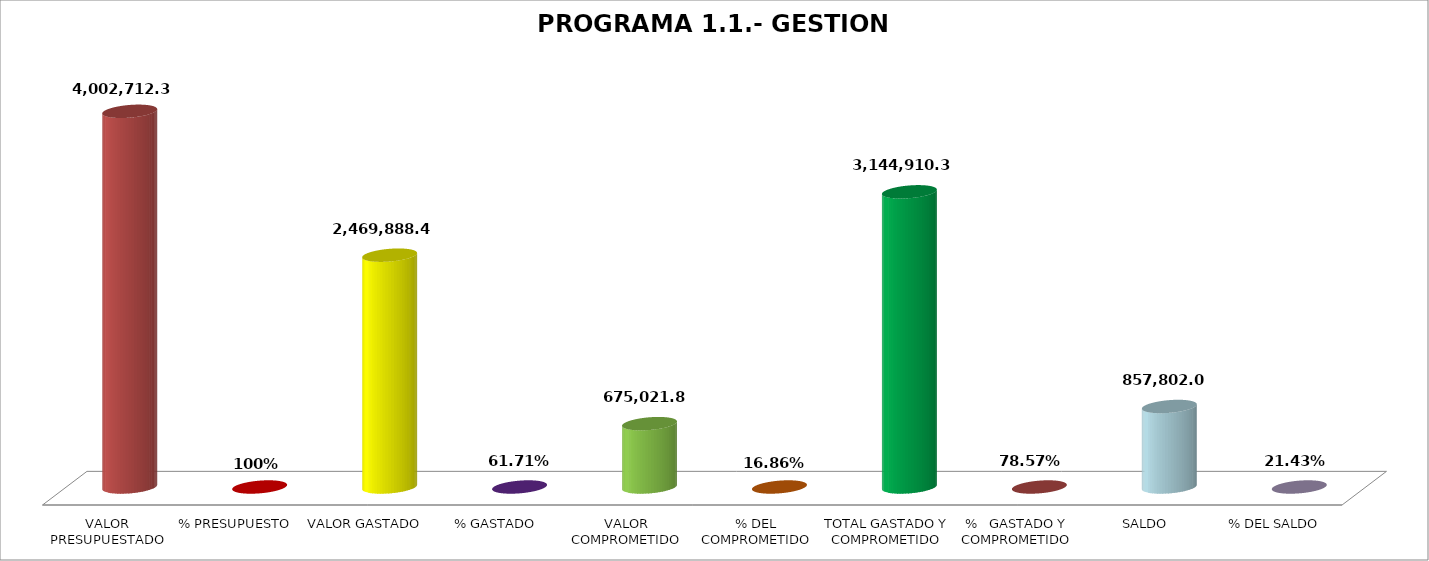
| Category | PROGRAMA 1.1.- GESTION ADMINISTRATIVA |
|---|---|
| VALOR PRESUPUESTADO | 4002712.33 |
| % PRESUPUESTO | 1 |
| VALOR GASTADO | 2469888.47 |
| % GASTADO | 0.617 |
| VALOR COMPROMETIDO | 675021.84 |
| % DEL COMPROMETIDO | 0.169 |
| TOTAL GASTADO Y COMPROMETIDO | 3144910.31 |
| %   GASTADO Y COMPROMETIDO | 0.786 |
| SALDO | 857802.02 |
| % DEL SALDO | 0.214 |